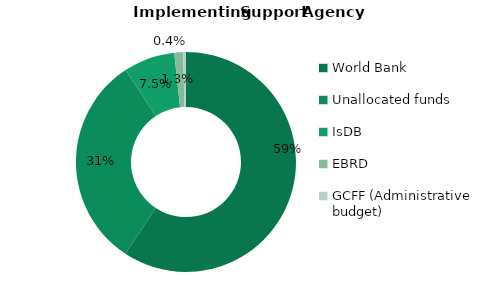
| Category | Series 0 |
|---|---|
| World Bank | 0.593 |
| Unallocated funds | 0.315 |
| IsDB | 0.075 |
| EBRD | 0.013 |
| GCFF (Administrative budget) | 0.004 |